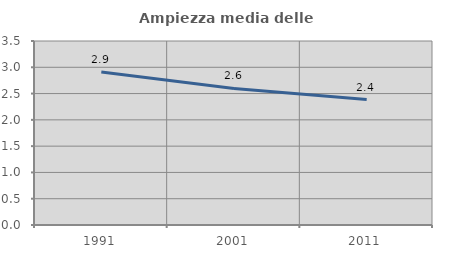
| Category | Ampiezza media delle famiglie |
|---|---|
| 1991.0 | 2.911 |
| 2001.0 | 2.597 |
| 2011.0 | 2.385 |